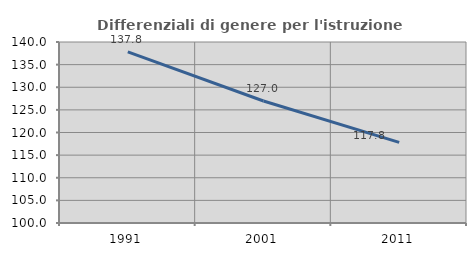
| Category | Differenziali di genere per l'istruzione superiore |
|---|---|
| 1991.0 | 137.805 |
| 2001.0 | 126.963 |
| 2011.0 | 117.806 |